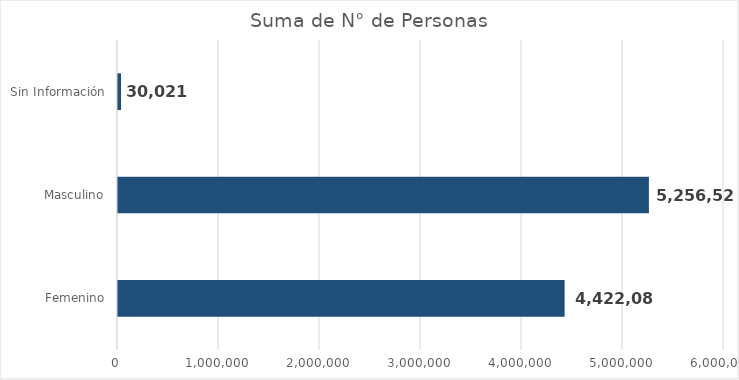
| Category | Series 0 |
|---|---|
| Femenino | 4422087 |
| Masculino | 5256528 |
| Sin Información | 30021 |